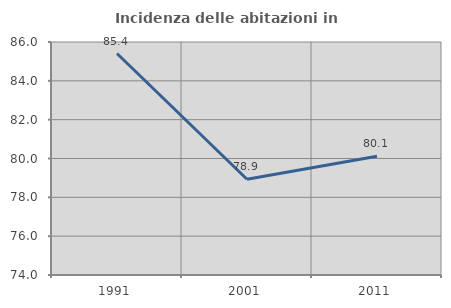
| Category | Incidenza delle abitazioni in proprietà  |
|---|---|
| 1991.0 | 85.408 |
| 2001.0 | 78.931 |
| 2011.0 | 80.12 |